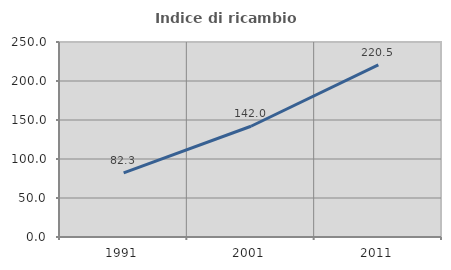
| Category | Indice di ricambio occupazionale  |
|---|---|
| 1991.0 | 82.292 |
| 2001.0 | 141.975 |
| 2011.0 | 220.548 |